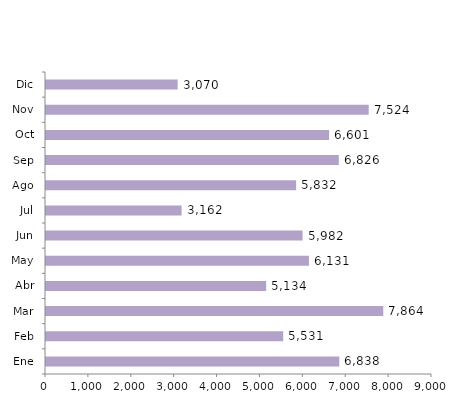
| Category | Series 0 |
|---|---|
| Ene | 6838 |
| Feb | 5531 |
| Mar | 7864 |
| Abr | 5134 |
| May | 6131 |
| Jun | 5982 |
| Jul | 3162 |
| Ago | 5832 |
| Sep | 6826 |
| Oct | 6601 |
| Nov | 7524 |
| Dic | 3070 |